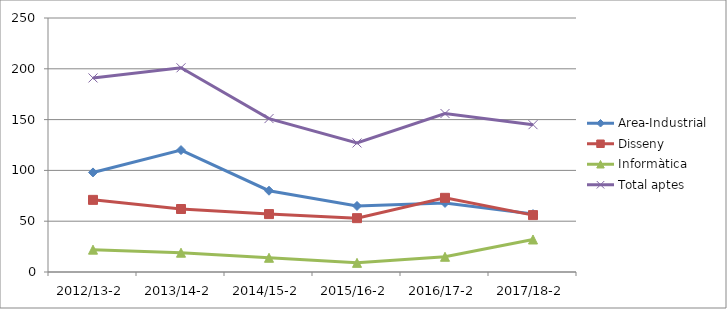
| Category | Area-Industrial | Disseny | Informàtica | Total aptes |
|---|---|---|---|---|
| 2012/13-2 | 98 | 71 | 22 | 191 |
| 2013/14-2 | 120 | 62 | 19 | 201 |
| 2014/15-2 | 80 | 57 | 14 | 151 |
| 2015/16-2 | 65 | 53 | 9 | 127 |
| 2016/17-2 | 68 | 73 | 15 | 156 |
| 2017/18-2 | 57 | 56 | 32 | 145 |